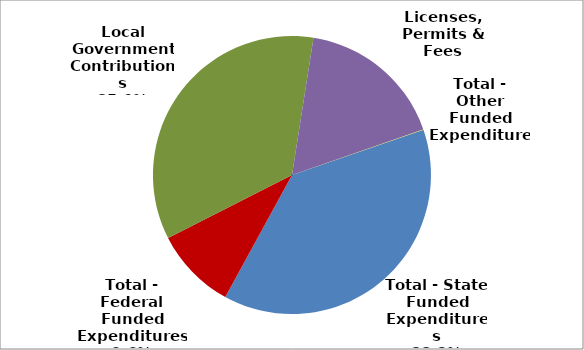
| Category | Series 0 |
|---|---|
| Total - State Funded Expenditures | 6904212 |
| Total - Federal Funded Expenditures | 1725128 |
| Local Government Contributions | 6309868 |
| Licenses, Permits & Fees | 3108155 |
| Total - Other Funded Expenditures | 5797 |